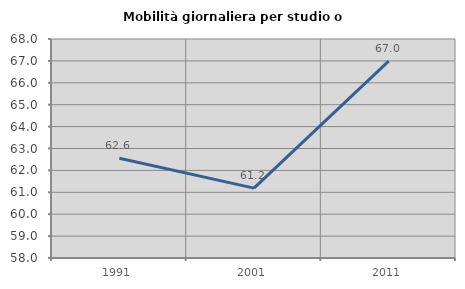
| Category | Mobilità giornaliera per studio o lavoro |
|---|---|
| 1991.0 | 62.557 |
| 2001.0 | 61.19 |
| 2011.0 | 66.993 |